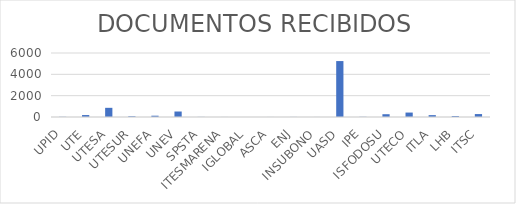
| Category | Series 0 |
|---|---|
| UPID | 17 |
| UTE | 182 |
| UTESA | 860 |
| UTESUR | 67 |
| UNEFA | 122 |
| UNEV | 515 |
| SPSTA | 10 |
| ITESMARENA | 4 |
| IGLOBAL | 2 |
| ASCA | 4 |
| ENJ | 7 |
| INSUBONO | 3 |
| UASD | 5244 |
| IPE | 17 |
| ISFODOSU | 261 |
| UTECO | 416 |
| ITLA | 175 |
| LHB | 92 |
| ITSC | 275 |